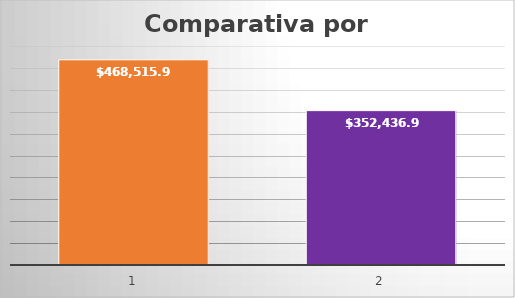
| Category | Series 0 |
|---|---|
| 0 | 468515.92 |
| 1 | 352436.91 |